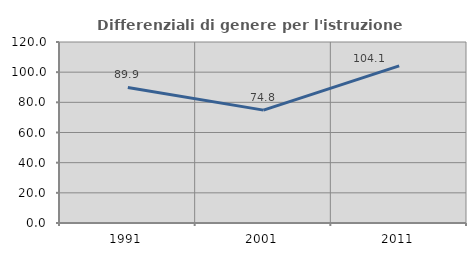
| Category | Differenziali di genere per l'istruzione superiore |
|---|---|
| 1991.0 | 89.897 |
| 2001.0 | 74.824 |
| 2011.0 | 104.145 |